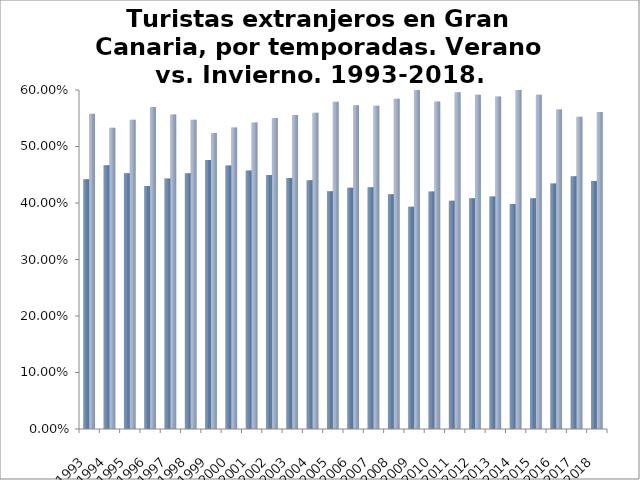
| Category | Series 0 | Series 1 |
|---|---|---|
| 1993.0 | 0.442 | 0.558 |
| 1994.0 | 0.467 | 0.533 |
| 1995.0 | 0.453 | 0.547 |
| 1996.0 | 0.43 | 0.57 |
| 1997.0 | 0.444 | 0.556 |
| 1998.0 | 0.453 | 0.547 |
| 1999.0 | 0.476 | 0.524 |
| 2000.0 | 0.466 | 0.534 |
| 2001.0 | 0.458 | 0.542 |
| 2002.0 | 0.449 | 0.551 |
| 2003.0 | 0.444 | 0.556 |
| 2004.0 | 0.44 | 0.56 |
| 2005.0 | 0.421 | 0.579 |
| 2006.0 | 0.427 | 0.573 |
| 2007.0 | 0.428 | 0.572 |
| 2008.0 | 0.415 | 0.585 |
| 2009.0 | 0.393 | 0.607 |
| 2010.0 | 0.42 | 0.58 |
| 2011.0 | 0.404 | 0.596 |
| 2012.0 | 0.408 | 0.592 |
| 2013.0 | 0.411 | 0.589 |
| 2014.0 | 0.398 | 0.602 |
| 2015.0 | 0.408 | 0.592 |
| 2016.0 | 0.435 | 0.565 |
| 2017.0 | 0.447 | 0.553 |
| 2018.0 | 0.439 | 0.561 |